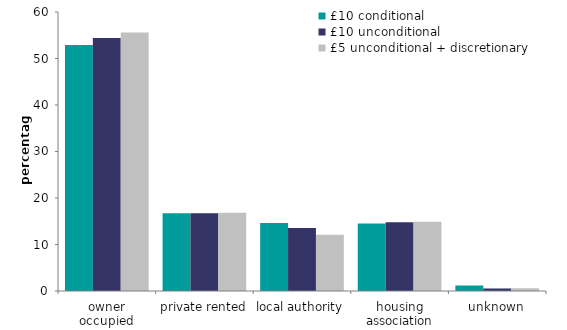
| Category | £10 conditional | £10 unconditional | £5 unconditional + discretionary |
|---|---|---|---|
| owner occupied | 52.924 | 54.408 | 55.611 |
| private rented | 16.747 | 16.727 | 16.834 |
| local authority | 14.637 | 13.527 | 12.079 |
| housing association | 14.509 | 14.795 | 14.885 |
| unknown | 1.182 | 0.543 | 0.591 |